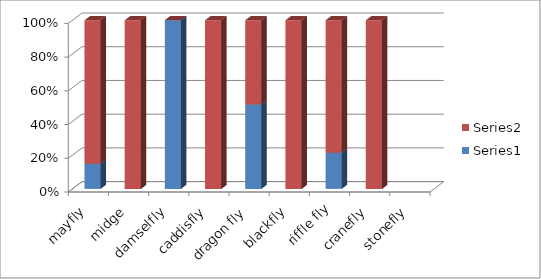
| Category | Series 0 | Series 1 |
|---|---|---|
| mayfly | 10 | 57 |
| midge | 0 | 14 |
| damselfly | 5 | 0 |
| caddisfly | 0 | 270 |
| dragon fly | 2 | 2 |
| blackfly | 0 | 1 |
| riffle fly | 3 | 11 |
| cranefly | 0 | 9 |
| stonefly | 0 | 0 |